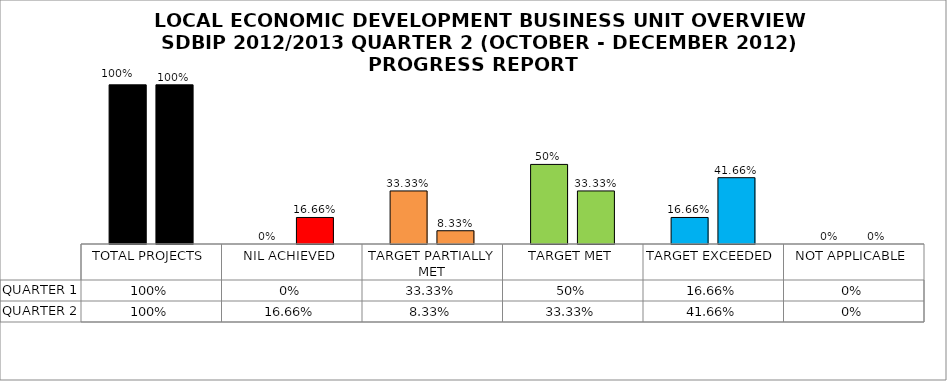
| Category | QUARTER 1 | QUARTER 2 |
|---|---|---|
| TOTAL PROJECTS | 1 | 1 |
| NIL ACHIEVED | 0 | 0.167 |
| TARGET PARTIALLY MET | 0.333 | 0.083 |
| TARGET MET | 0.5 | 0.333 |
| TARGET EXCEEDED | 0.167 | 0.417 |
| NOT APPLICABLE | 0 | 0 |